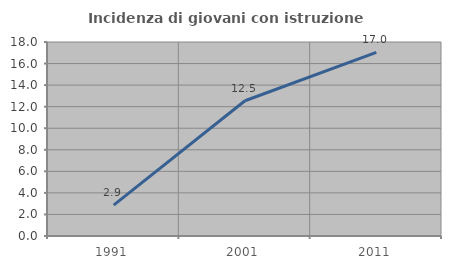
| Category | Incidenza di giovani con istruzione universitaria |
|---|---|
| 1991.0 | 2.871 |
| 2001.0 | 12.548 |
| 2011.0 | 17.031 |